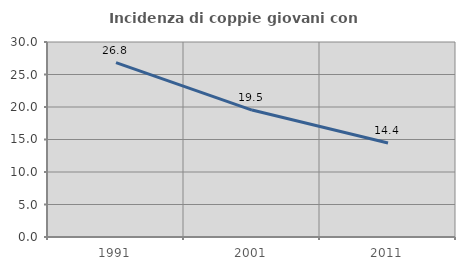
| Category | Incidenza di coppie giovani con figli |
|---|---|
| 1991.0 | 26.824 |
| 2001.0 | 19.529 |
| 2011.0 | 14.449 |